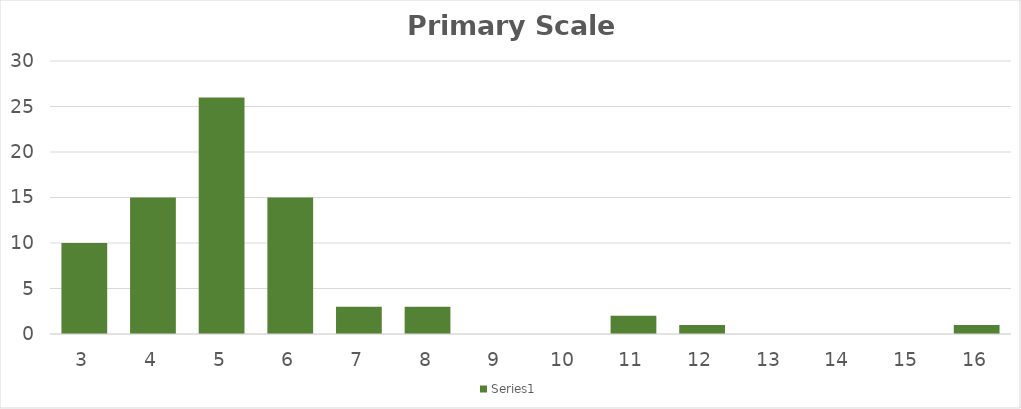
| Category | Series 1 |
|---|---|
| 0.66 | 1 |
| 0.67 | 1 |
| 0.68 | 0 |
| 0.69 | 0 |
| 0.7 | 0 |
| 0.71 | 0 |
| 0.72 | 2 |
| 0.73 | 0 |
| 0.74 | 2 |
| 0.75 | 1 |
| 0.76 | 2 |
| 0.77 | 0 |
| 0.78 | 1 |
| 0.79 | 2 |
| 0.8 | 3 |
| 0.81 | 4 |
| 0.82 | 5 |
| 0.83 | 6 |
| 0.84 | 12 |
| 0.85 | 6 |
| 0.86 | 10 |
| 0.87 | 6 |
| 0.88 | 9 |
| 0.89 | 1 |
| 0.9 | 0 |
| 0.91 | 0 |
| 0.92 | 0 |
| 0.93 | 1 |
| 0.94 | 0 |
| 0.95 | 0 |
| 0.96 | 1 |